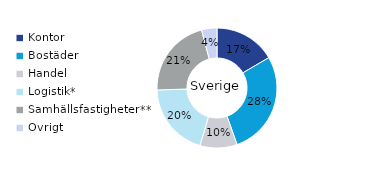
| Category | Sverige |
|---|---|
| Kontor | 0.166 |
| Bostäder | 0.28 |
| Handel | 0.1 |
| Logistik* | 0.199 |
| Samhällsfastigheter** | 0.214 |
| Övrigt | 0.041 |